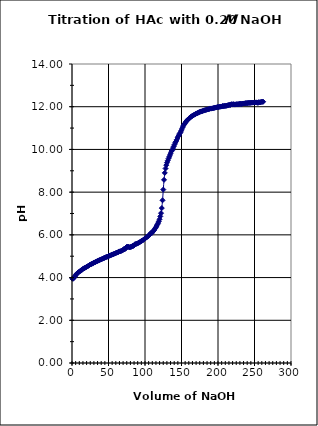
| Category | Series 0 |
|---|---|
| 0.507 | 3.945 |
| 1.529 | 3.946 |
| 2.549 | 3.985 |
| 3.571 | 4.043 |
| 4.591 | 4.09 |
| 5.612 | 4.132 |
| 6.633 | 4.184 |
| 7.654 | 4.22 |
| 8.675 | 4.24 |
| 9.696 | 4.268 |
| 10.717 | 4.294 |
| 11.738 | 4.32 |
| 12.759 | 4.345 |
| 13.78 | 4.363 |
| 14.801 | 4.399 |
| 15.822 | 4.426 |
| 16.843 | 4.44 |
| 17.863 | 4.46 |
| 18.885 | 4.477 |
| 19.905 | 4.5 |
| 20.927 | 4.518 |
| 21.948 | 4.54 |
| 22.968 | 4.564 |
| 23.989 | 4.585 |
| 25.01 | 4.609 |
| 26.031 | 4.621 |
| 27.052 | 4.645 |
| 28.073 | 4.653 |
| 29.094 | 4.675 |
| 30.115 | 4.7 |
| 31.136 | 4.712 |
| 32.157 | 4.727 |
| 33.178 | 4.748 |
| 34.199 | 4.763 |
| 35.22 | 4.782 |
| 36.241 | 4.796 |
| 37.262 | 4.813 |
| 38.283 | 4.828 |
| 39.304 | 4.846 |
| 40.324 | 4.858 |
| 41.345 | 4.875 |
| 42.366 | 4.89 |
| 43.387 | 4.91 |
| 44.408 | 4.918 |
| 45.429 | 4.936 |
| 46.45 | 4.959 |
| 47.471 | 4.968 |
| 48.492 | 4.977 |
| 49.513 | 4.982 |
| 50.534 | 5.018 |
| 51.555 | 5.027 |
| 52.576 | 5.038 |
| 53.597 | 5.057 |
| 54.618 | 5.069 |
| 55.639 | 5.083 |
| 56.66 | 5.097 |
| 57.681 | 5.112 |
| 58.702 | 5.125 |
| 59.723 | 5.144 |
| 60.744 | 5.157 |
| 61.765 | 5.17 |
| 62.786 | 5.184 |
| 63.807 | 5.2 |
| 64.828 | 5.224 |
| 65.849 | 5.228 |
| 66.87 | 5.239 |
| 67.891 | 5.253 |
| 68.912 | 5.268 |
| 69.933 | 5.299 |
| 70.954 | 5.332 |
| 71.975 | 5.322 |
| 72.996 | 5.35 |
| 74.017 | 5.387 |
| 75.038 | 5.44 |
| 76.059 | 5.45 |
| 77.08 | 5.44 |
| 78.101 | 5.43 |
| 79.122 | 5.417 |
| 80.143 | 5.433 |
| 81.164 | 5.438 |
| 82.184 | 5.46 |
| 83.206 | 5.49 |
| 84.227 | 5.48 |
| 85.248 | 5.51 |
| 86.269 | 5.56 |
| 87.289 | 5.57 |
| 88.311 | 5.58 |
| 89.331 | 5.592 |
| 90.353 | 5.607 |
| 91.373 | 5.635 |
| 92.394 | 5.648 |
| 93.415 | 5.676 |
| 94.436 | 5.696 |
| 95.457 | 5.719 |
| 96.478 | 5.734 |
| 97.499 | 5.763 |
| 98.52 | 5.787 |
| 99.541 | 5.813 |
| 100.562 | 5.844 |
| 101.583 | 5.869 |
| 102.604 | 5.892 |
| 103.625 | 5.923 |
| 104.646 | 5.953 |
| 105.667 | 5.988 |
| 106.688 | 6.023 |
| 107.709 | 6.068 |
| 108.729 | 6.102 |
| 109.75 | 6.098 |
| 110.771 | 6.162 |
| 111.792 | 6.192 |
| 112.813 | 6.233 |
| 113.834 | 6.297 |
| 114.855 | 6.353 |
| 115.876 | 6.413 |
| 116.897 | 6.477 |
| 117.918 | 6.548 |
| 118.939 | 6.633 |
| 119.96 | 6.73 |
| 120.981 | 6.866 |
| 122.002 | 7.016 |
| 123.023 | 7.254 |
| 124.044 | 7.618 |
| 125.065 | 8.12 |
| 126.086 | 8.576 |
| 127.107 | 8.902 |
| 128.129 | 9.108 |
| 129.15 | 9.264 |
| 130.171 | 9.379 |
| 131.192 | 9.478 |
| 132.213 | 9.575 |
| 133.234 | 9.655 |
| 134.255 | 9.74 |
| 135.276 | 9.828 |
| 136.297 | 9.92 |
| 137.318 | 9.964 |
| 138.339 | 10.063 |
| 139.36 | 10.14 |
| 140.382 | 10.225 |
| 141.403 | 10.309 |
| 142.424 | 10.372 |
| 143.445 | 10.451 |
| 144.466 | 10.539 |
| 145.487 | 10.611 |
| 146.508 | 10.672 |
| 147.53 | 10.743 |
| 148.551 | 10.801 |
| 149.572 | 10.872 |
| 150.593 | 10.959 |
| 151.614 | 11.042 |
| 152.635 | 11.11 |
| 153.656 | 11.176 |
| 154.677 | 11.221 |
| 155.698 | 11.277 |
| 156.719 | 11.324 |
| 157.741 | 11.367 |
| 158.762 | 11.389 |
| 159.783 | 11.431 |
| 160.804 | 11.46 |
| 161.825 | 11.49 |
| 162.846 | 11.522 |
| 163.867 | 11.554 |
| 164.888 | 11.571 |
| 165.909 | 11.591 |
| 166.93 | 11.613 |
| 167.952 | 11.633 |
| 168.973 | 11.65 |
| 169.994 | 11.675 |
| 171.015 | 11.688 |
| 172.036 | 11.705 |
| 173.057 | 11.72 |
| 174.078 | 11.742 |
| 175.099 | 11.758 |
| 176.121 | 11.767 |
| 177.142 | 11.783 |
| 178.163 | 11.785 |
| 179.184 | 11.803 |
| 180.205 | 11.816 |
| 181.226 | 11.831 |
| 182.247 | 11.839 |
| 183.268 | 11.847 |
| 184.289 | 11.858 |
| 185.31 | 11.87 |
| 186.331 | 11.878 |
| 187.353 | 11.89 |
| 188.374 | 11.896 |
| 189.395 | 11.919 |
| 190.416 | 11.908 |
| 191.437 | 11.918 |
| 192.458 | 11.925 |
| 193.479 | 11.93 |
| 194.5 | 11.948 |
| 195.521 | 11.947 |
| 196.542 | 11.96 |
| 197.563 | 11.965 |
| 198.584 | 11.973 |
| 199.605 | 11.987 |
| 200.626 | 11.979 |
| 201.647 | 11.998 |
| 202.668 | 11.998 |
| 203.689 | 12.003 |
| 204.711 | 12.011 |
| 205.732 | 12.014 |
| 206.753 | 12.043 |
| 207.774 | 12.021 |
| 208.795 | 12.037 |
| 209.816 | 12.037 |
| 210.837 | 12.044 |
| 211.858 | 12.044 |
| 212.879 | 12.056 |
| 213.9 | 12.082 |
| 214.922 | 12.066 |
| 215.943 | 12.095 |
| 216.964 | 12.08 |
| 217.985 | 12.11 |
| 219.006 | 12.121 |
| 220.027 | 12.1 |
| 221.048 | 12.12 |
| 222.069 | 12.11 |
| 223.091 | 12.1 |
| 224.112 | 12.11 |
| 225.133 | 12.117 |
| 226.154 | 12.116 |
| 227.175 | 12.115 |
| 228.196 | 12.121 |
| 229.217 | 12.13 |
| 230.238 | 12.14 |
| 231.259 | 12.133 |
| 232.28 | 12.129 |
| 233.302 | 12.138 |
| 234.323 | 12.15 |
| 235.344 | 12.152 |
| 236.365 | 12.155 |
| 237.386 | 12.162 |
| 238.407 | 12.17 |
| 239.428 | 12.165 |
| 240.449 | 12.171 |
| 241.47 | 12.177 |
| 242.492 | 12.179 |
| 243.513 | 12.181 |
| 244.534 | 12.181 |
| 245.555 | 12.189 |
| 246.576 | 12.19 |
| 247.597 | 12.193 |
| 248.618 | 12.195 |
| 249.639 | 12.195 |
| 250.66 | 12.198 |
| 251.681 | 12.202 |
| 252.703 | 12.203 |
| 253.724 | 12.19 |
| 254.745 | 12.18 |
| 255.766 | 12.212 |
| 256.787 | 12.206 |
| 257.808 | 12.205 |
| 258.829 | 12.221 |
| 259.851 | 12.228 |
| 260.872 | 12.229 |
| 261.893 | 12.233 |